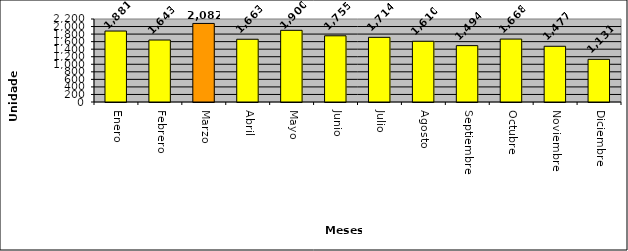
| Category | Total |
|---|---|
| Enero | 1881 |
| Febrero | 1643 |
| Marzo | 2082 |
| Abril | 1663 |
| Mayo | 1900 |
| Junio | 1755 |
| Julio | 1714 |
| Agosto | 1610 |
| Septiembre | 1494 |
| Octubre | 1668 |
| Noviembre | 1477 |
| Diciembre | 1131 |